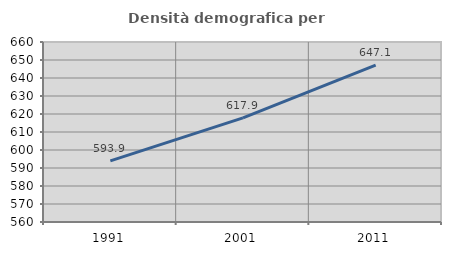
| Category | Densità demografica |
|---|---|
| 1991.0 | 593.919 |
| 2001.0 | 617.853 |
| 2011.0 | 647.106 |